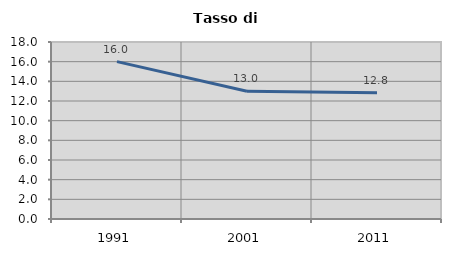
| Category | Tasso di disoccupazione   |
|---|---|
| 1991.0 | 16.007 |
| 2001.0 | 12.987 |
| 2011.0 | 12.833 |